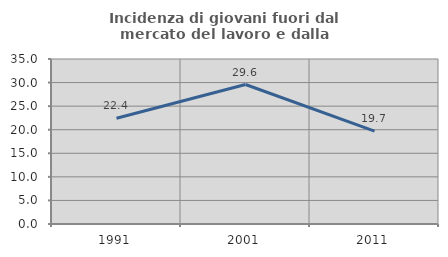
| Category | Incidenza di giovani fuori dal mercato del lavoro e dalla formazione  |
|---|---|
| 1991.0 | 22.439 |
| 2001.0 | 29.586 |
| 2011.0 | 19.683 |